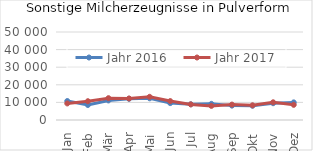
| Category | Jahr 2016 | Jahr 2017 |
|---|---|---|
| Jan | 10776.511 | 9406.545 |
| Feb | 8524.121 | 10676.135 |
| Mär | 11110.517 | 12412.736 |
| Apr | 12052.654 | 12214.242 |
| Mai | 12318.844 | 13172.502 |
| Jun | 9597.156 | 10744.159 |
| Jul | 8927.543 | 8871.409 |
| Aug | 9174.343 | 8020.851 |
| Sep | 8169.349 | 8745.761 |
| Okt | 8098.923 | 8332.878 |
| Nov | 9538.29 | 10062.179 |
| Dez | 10003.355 | 8619.216 |